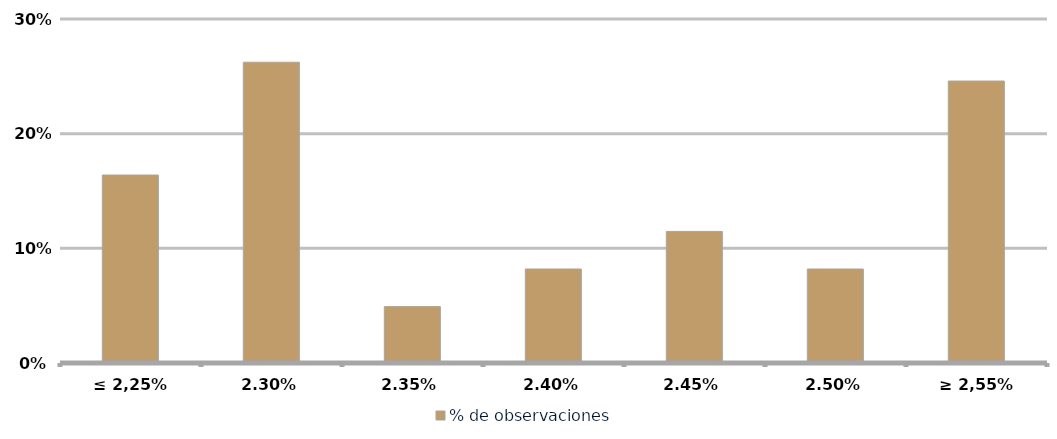
| Category | % de observaciones  |
|---|---|
| ≤ 2,25% | 0.164 |
| 2,30% | 0.262 |
| 2,35% | 0.049 |
| 2,40% | 0.082 |
| 2,45% | 0.115 |
| 2,50% | 0.082 |
| ≥ 2,55% | 0.246 |